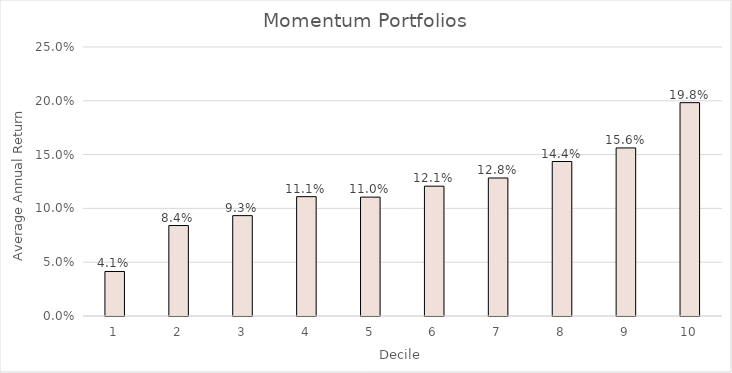
| Category | Series 0 |
|---|---|
| 0 | 0.041 |
| 1 | 0.084 |
| 2 | 0.093 |
| 3 | 0.111 |
| 4 | 0.11 |
| 5 | 0.121 |
| 6 | 0.128 |
| 7 | 0.144 |
| 8 | 0.156 |
| 9 | 0.198 |